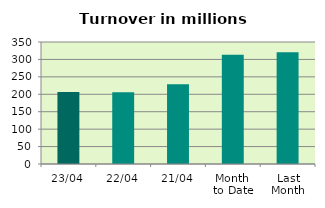
| Category | Series 0 |
|---|---|
| 23/04 | 206.569 |
| 22/04 | 205.888 |
| 21/04 | 228.875 |
| Month 
to Date | 313.191 |
| Last
Month | 320.663 |